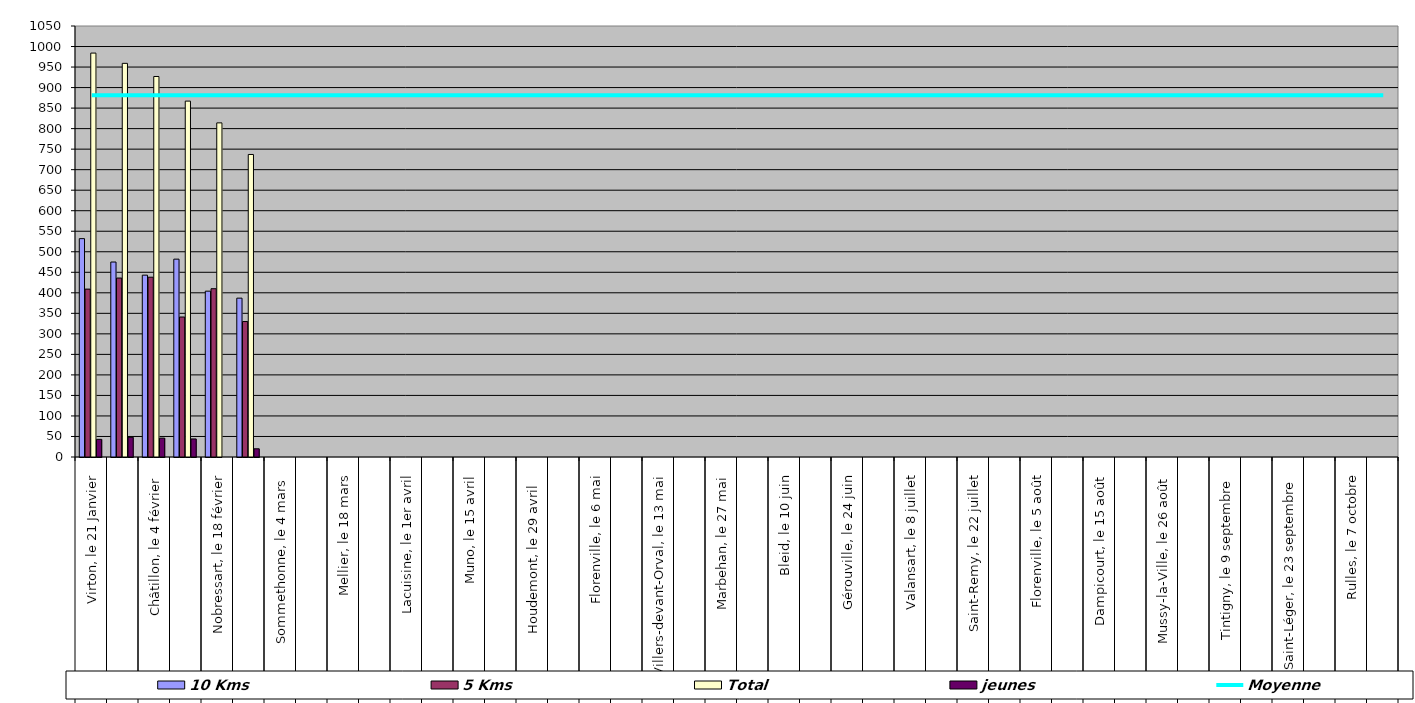
| Category | 10 Kms | 5 Kms | Total | jeunes |
|---|---|---|---|---|
| 0 | 532 | 409 | 984 | 43 |
| 1 | 475 | 436 | 959 | 48 |
| 2 | 443 | 438 | 927 | 46 |
| 3 | 482 | 341 | 867 | 44 |
| 4 | 404 | 410 | 814 | 0 |
| 5 | 387 | 330 | 737 | 20 |
| 6 | 0 | 0 | 0 | 0 |
| 7 | 0 | 0 | 0 | 0 |
| 8 | 0 | 0 | 0 | 0 |
| 9 | 0 | 0 | 0 | 0 |
| 10 | 0 | 0 | 0 | 0 |
| 11 | 0 | 0 | 0 | 0 |
| 12 | 0 | 0 | 0 | 0 |
| 13 | 0 | 0 | 0 | 0 |
| 14 | 0 | 0 | 0 | 0 |
| 15 | 0 | 0 | 0 | 0 |
| 16 | 0 | 0 | 0 | 0 |
| 17 | 0 | 0 | 0 | 0 |
| 18 | 0 | 0 | 0 | 0 |
| 19 | 0 | 0 | 0 | 0 |
| 20 | 0 | 0 | 0 | 0 |
| 21 | 0 | 0 | 0 | 0 |
| 22 | 0 | 0 | 0 | 0 |
| 23 | 0 | 0 | 0 | 0 |
| 24 | 0 | 0 | 0 | 0 |
| 25 | 0 | 0 | 0 | 0 |
| 26 | 0 | 0 | 0 | 0 |
| 27 | 0 | 0 | 0 | 0 |
| 28 | 0 | 0 | 0 | 0 |
| 29 | 0 | 0 | 0 | 0 |
| 30 | 0 | 0 | 0 | 0 |
| 31 | 0 | 0 | 0 | 0 |
| 32 | 0 | 0 | 0 | 0 |
| 33 | 0 | 0 | 0 | 0 |
| 34 | 0 | 0 | 0 | 0 |
| 35 | 0 | 0 | 0 | 0 |
| 36 | 0 | 0 | 0 | 0 |
| 37 | 0 | 0 | 0 | 0 |
| 38 | 0 | 0 | 0 | 0 |
| 39 | 0 | 0 | 0 | 0 |
| 40 | 0 | 0 | 0 | 0 |
| 41 | 0 | 0 | 0 | 0 |